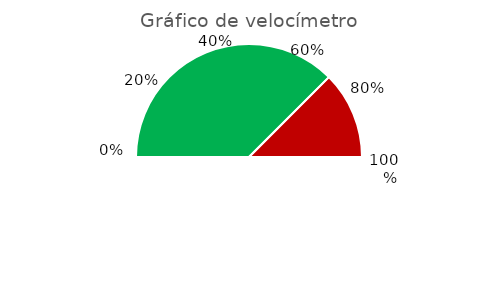
| Category | Series 0 |
|---|---|
| Valor 1 | 0.75 |
| Valor 2 | 0.25 |
| Segmento Blanco | 1 |